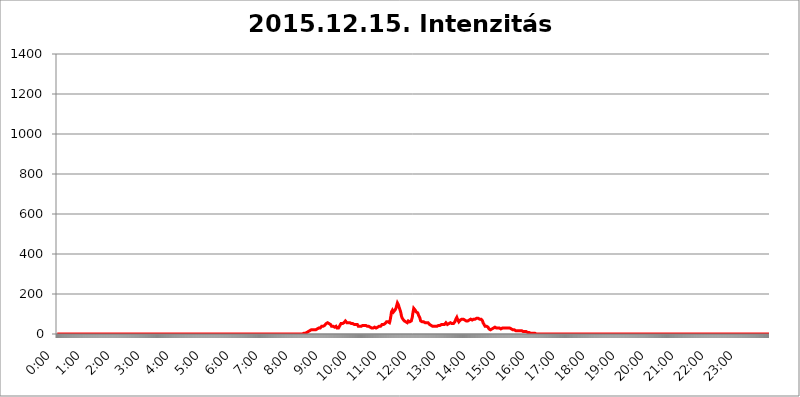
| Category | 2015.12.15. Intenzitás [W/m^2] |
|---|---|
| 0.0 | 0 |
| 0.0006944444444444445 | 0 |
| 0.001388888888888889 | 0 |
| 0.0020833333333333333 | 0 |
| 0.002777777777777778 | 0 |
| 0.003472222222222222 | 0 |
| 0.004166666666666667 | 0 |
| 0.004861111111111111 | 0 |
| 0.005555555555555556 | 0 |
| 0.0062499999999999995 | 0 |
| 0.006944444444444444 | 0 |
| 0.007638888888888889 | 0 |
| 0.008333333333333333 | 0 |
| 0.009027777777777779 | 0 |
| 0.009722222222222222 | 0 |
| 0.010416666666666666 | 0 |
| 0.011111111111111112 | 0 |
| 0.011805555555555555 | 0 |
| 0.012499999999999999 | 0 |
| 0.013194444444444444 | 0 |
| 0.013888888888888888 | 0 |
| 0.014583333333333332 | 0 |
| 0.015277777777777777 | 0 |
| 0.015972222222222224 | 0 |
| 0.016666666666666666 | 0 |
| 0.017361111111111112 | 0 |
| 0.018055555555555557 | 0 |
| 0.01875 | 0 |
| 0.019444444444444445 | 0 |
| 0.02013888888888889 | 0 |
| 0.020833333333333332 | 0 |
| 0.02152777777777778 | 0 |
| 0.022222222222222223 | 0 |
| 0.02291666666666667 | 0 |
| 0.02361111111111111 | 0 |
| 0.024305555555555556 | 0 |
| 0.024999999999999998 | 0 |
| 0.025694444444444447 | 0 |
| 0.02638888888888889 | 0 |
| 0.027083333333333334 | 0 |
| 0.027777777777777776 | 0 |
| 0.02847222222222222 | 0 |
| 0.029166666666666664 | 0 |
| 0.029861111111111113 | 0 |
| 0.030555555555555555 | 0 |
| 0.03125 | 0 |
| 0.03194444444444445 | 0 |
| 0.03263888888888889 | 0 |
| 0.03333333333333333 | 0 |
| 0.034027777777777775 | 0 |
| 0.034722222222222224 | 0 |
| 0.035416666666666666 | 0 |
| 0.036111111111111115 | 0 |
| 0.03680555555555556 | 0 |
| 0.0375 | 0 |
| 0.03819444444444444 | 0 |
| 0.03888888888888889 | 0 |
| 0.03958333333333333 | 0 |
| 0.04027777777777778 | 0 |
| 0.04097222222222222 | 0 |
| 0.041666666666666664 | 0 |
| 0.042361111111111106 | 0 |
| 0.04305555555555556 | 0 |
| 0.043750000000000004 | 0 |
| 0.044444444444444446 | 0 |
| 0.04513888888888889 | 0 |
| 0.04583333333333334 | 0 |
| 0.04652777777777778 | 0 |
| 0.04722222222222222 | 0 |
| 0.04791666666666666 | 0 |
| 0.04861111111111111 | 0 |
| 0.049305555555555554 | 0 |
| 0.049999999999999996 | 0 |
| 0.05069444444444445 | 0 |
| 0.051388888888888894 | 0 |
| 0.052083333333333336 | 0 |
| 0.05277777777777778 | 0 |
| 0.05347222222222222 | 0 |
| 0.05416666666666667 | 0 |
| 0.05486111111111111 | 0 |
| 0.05555555555555555 | 0 |
| 0.05625 | 0 |
| 0.05694444444444444 | 0 |
| 0.057638888888888885 | 0 |
| 0.05833333333333333 | 0 |
| 0.05902777777777778 | 0 |
| 0.059722222222222225 | 0 |
| 0.06041666666666667 | 0 |
| 0.061111111111111116 | 0 |
| 0.06180555555555556 | 0 |
| 0.0625 | 0 |
| 0.06319444444444444 | 0 |
| 0.06388888888888888 | 0 |
| 0.06458333333333334 | 0 |
| 0.06527777777777778 | 0 |
| 0.06597222222222222 | 0 |
| 0.06666666666666667 | 0 |
| 0.06736111111111111 | 0 |
| 0.06805555555555555 | 0 |
| 0.06874999999999999 | 0 |
| 0.06944444444444443 | 0 |
| 0.07013888888888889 | 0 |
| 0.07083333333333333 | 0 |
| 0.07152777777777779 | 0 |
| 0.07222222222222223 | 0 |
| 0.07291666666666667 | 0 |
| 0.07361111111111111 | 0 |
| 0.07430555555555556 | 0 |
| 0.075 | 0 |
| 0.07569444444444444 | 0 |
| 0.0763888888888889 | 0 |
| 0.07708333333333334 | 0 |
| 0.07777777777777778 | 0 |
| 0.07847222222222222 | 0 |
| 0.07916666666666666 | 0 |
| 0.0798611111111111 | 0 |
| 0.08055555555555556 | 0 |
| 0.08125 | 0 |
| 0.08194444444444444 | 0 |
| 0.08263888888888889 | 0 |
| 0.08333333333333333 | 0 |
| 0.08402777777777777 | 0 |
| 0.08472222222222221 | 0 |
| 0.08541666666666665 | 0 |
| 0.08611111111111112 | 0 |
| 0.08680555555555557 | 0 |
| 0.08750000000000001 | 0 |
| 0.08819444444444445 | 0 |
| 0.08888888888888889 | 0 |
| 0.08958333333333333 | 0 |
| 0.09027777777777778 | 0 |
| 0.09097222222222222 | 0 |
| 0.09166666666666667 | 0 |
| 0.09236111111111112 | 0 |
| 0.09305555555555556 | 0 |
| 0.09375 | 0 |
| 0.09444444444444444 | 0 |
| 0.09513888888888888 | 0 |
| 0.09583333333333333 | 0 |
| 0.09652777777777777 | 0 |
| 0.09722222222222222 | 0 |
| 0.09791666666666667 | 0 |
| 0.09861111111111111 | 0 |
| 0.09930555555555555 | 0 |
| 0.09999999999999999 | 0 |
| 0.10069444444444443 | 0 |
| 0.1013888888888889 | 0 |
| 0.10208333333333335 | 0 |
| 0.10277777777777779 | 0 |
| 0.10347222222222223 | 0 |
| 0.10416666666666667 | 0 |
| 0.10486111111111111 | 0 |
| 0.10555555555555556 | 0 |
| 0.10625 | 0 |
| 0.10694444444444444 | 0 |
| 0.1076388888888889 | 0 |
| 0.10833333333333334 | 0 |
| 0.10902777777777778 | 0 |
| 0.10972222222222222 | 0 |
| 0.1111111111111111 | 0 |
| 0.11180555555555556 | 0 |
| 0.11180555555555556 | 0 |
| 0.1125 | 0 |
| 0.11319444444444444 | 0 |
| 0.11388888888888889 | 0 |
| 0.11458333333333333 | 0 |
| 0.11527777777777777 | 0 |
| 0.11597222222222221 | 0 |
| 0.11666666666666665 | 0 |
| 0.1173611111111111 | 0 |
| 0.11805555555555557 | 0 |
| 0.11944444444444445 | 0 |
| 0.12013888888888889 | 0 |
| 0.12083333333333333 | 0 |
| 0.12152777777777778 | 0 |
| 0.12222222222222223 | 0 |
| 0.12291666666666667 | 0 |
| 0.12291666666666667 | 0 |
| 0.12361111111111112 | 0 |
| 0.12430555555555556 | 0 |
| 0.125 | 0 |
| 0.12569444444444444 | 0 |
| 0.12638888888888888 | 0 |
| 0.12708333333333333 | 0 |
| 0.16875 | 0 |
| 0.12847222222222224 | 0 |
| 0.12916666666666668 | 0 |
| 0.12986111111111112 | 0 |
| 0.13055555555555556 | 0 |
| 0.13125 | 0 |
| 0.13194444444444445 | 0 |
| 0.1326388888888889 | 0 |
| 0.13333333333333333 | 0 |
| 0.13402777777777777 | 0 |
| 0.13402777777777777 | 0 |
| 0.13472222222222222 | 0 |
| 0.13541666666666666 | 0 |
| 0.1361111111111111 | 0 |
| 0.13749999999999998 | 0 |
| 0.13819444444444443 | 0 |
| 0.1388888888888889 | 0 |
| 0.13958333333333334 | 0 |
| 0.14027777777777778 | 0 |
| 0.14097222222222222 | 0 |
| 0.14166666666666666 | 0 |
| 0.1423611111111111 | 0 |
| 0.14305555555555557 | 0 |
| 0.14375000000000002 | 0 |
| 0.14444444444444446 | 0 |
| 0.1451388888888889 | 0 |
| 0.1451388888888889 | 0 |
| 0.14652777777777778 | 0 |
| 0.14722222222222223 | 0 |
| 0.14791666666666667 | 0 |
| 0.1486111111111111 | 0 |
| 0.14930555555555555 | 0 |
| 0.15 | 0 |
| 0.15069444444444444 | 0 |
| 0.15138888888888888 | 0 |
| 0.15208333333333332 | 0 |
| 0.15277777777777776 | 0 |
| 0.15347222222222223 | 0 |
| 0.15416666666666667 | 0 |
| 0.15486111111111112 | 0 |
| 0.15555555555555556 | 0 |
| 0.15625 | 0 |
| 0.15694444444444444 | 0 |
| 0.15763888888888888 | 0 |
| 0.15833333333333333 | 0 |
| 0.15902777777777777 | 0 |
| 0.15972222222222224 | 0 |
| 0.16041666666666668 | 0 |
| 0.16111111111111112 | 0 |
| 0.16180555555555556 | 0 |
| 0.1625 | 0 |
| 0.16319444444444445 | 0 |
| 0.1638888888888889 | 0 |
| 0.16458333333333333 | 0 |
| 0.16527777777777777 | 0 |
| 0.16597222222222222 | 0 |
| 0.16666666666666666 | 0 |
| 0.1673611111111111 | 0 |
| 0.16805555555555554 | 0 |
| 0.16874999999999998 | 0 |
| 0.16944444444444443 | 0 |
| 0.17013888888888887 | 0 |
| 0.1708333333333333 | 0 |
| 0.17152777777777775 | 0 |
| 0.17222222222222225 | 0 |
| 0.1729166666666667 | 0 |
| 0.17361111111111113 | 0 |
| 0.17430555555555557 | 0 |
| 0.17500000000000002 | 0 |
| 0.17569444444444446 | 0 |
| 0.1763888888888889 | 0 |
| 0.17708333333333334 | 0 |
| 0.17777777777777778 | 0 |
| 0.17847222222222223 | 0 |
| 0.17916666666666667 | 0 |
| 0.1798611111111111 | 0 |
| 0.18055555555555555 | 0 |
| 0.18125 | 0 |
| 0.18194444444444444 | 0 |
| 0.1826388888888889 | 0 |
| 0.18333333333333335 | 0 |
| 0.1840277777777778 | 0 |
| 0.18472222222222223 | 0 |
| 0.18541666666666667 | 0 |
| 0.18611111111111112 | 0 |
| 0.18680555555555556 | 0 |
| 0.1875 | 0 |
| 0.18819444444444444 | 0 |
| 0.18888888888888888 | 0 |
| 0.18958333333333333 | 0 |
| 0.19027777777777777 | 0 |
| 0.1909722222222222 | 0 |
| 0.19166666666666665 | 0 |
| 0.19236111111111112 | 0 |
| 0.19305555555555554 | 0 |
| 0.19375 | 0 |
| 0.19444444444444445 | 0 |
| 0.1951388888888889 | 0 |
| 0.19583333333333333 | 0 |
| 0.19652777777777777 | 0 |
| 0.19722222222222222 | 0 |
| 0.19791666666666666 | 0 |
| 0.1986111111111111 | 0 |
| 0.19930555555555554 | 0 |
| 0.19999999999999998 | 0 |
| 0.20069444444444443 | 0 |
| 0.20138888888888887 | 0 |
| 0.2020833333333333 | 0 |
| 0.2027777777777778 | 0 |
| 0.2034722222222222 | 0 |
| 0.2041666666666667 | 0 |
| 0.20486111111111113 | 0 |
| 0.20555555555555557 | 0 |
| 0.20625000000000002 | 0 |
| 0.20694444444444446 | 0 |
| 0.2076388888888889 | 0 |
| 0.20833333333333334 | 0 |
| 0.20902777777777778 | 0 |
| 0.20972222222222223 | 0 |
| 0.21041666666666667 | 0 |
| 0.2111111111111111 | 0 |
| 0.21180555555555555 | 0 |
| 0.2125 | 0 |
| 0.21319444444444444 | 0 |
| 0.2138888888888889 | 0 |
| 0.21458333333333335 | 0 |
| 0.2152777777777778 | 0 |
| 0.21597222222222223 | 0 |
| 0.21666666666666667 | 0 |
| 0.21736111111111112 | 0 |
| 0.21805555555555556 | 0 |
| 0.21875 | 0 |
| 0.21944444444444444 | 0 |
| 0.22013888888888888 | 0 |
| 0.22083333333333333 | 0 |
| 0.22152777777777777 | 0 |
| 0.2222222222222222 | 0 |
| 0.22291666666666665 | 0 |
| 0.2236111111111111 | 0 |
| 0.22430555555555556 | 0 |
| 0.225 | 0 |
| 0.22569444444444445 | 0 |
| 0.2263888888888889 | 0 |
| 0.22708333333333333 | 0 |
| 0.22777777777777777 | 0 |
| 0.22847222222222222 | 0 |
| 0.22916666666666666 | 0 |
| 0.2298611111111111 | 0 |
| 0.23055555555555554 | 0 |
| 0.23124999999999998 | 0 |
| 0.23194444444444443 | 0 |
| 0.23263888888888887 | 0 |
| 0.2333333333333333 | 0 |
| 0.2340277777777778 | 0 |
| 0.2347222222222222 | 0 |
| 0.2354166666666667 | 0 |
| 0.23611111111111113 | 0 |
| 0.23680555555555557 | 0 |
| 0.23750000000000002 | 0 |
| 0.23819444444444446 | 0 |
| 0.2388888888888889 | 0 |
| 0.23958333333333334 | 0 |
| 0.24027777777777778 | 0 |
| 0.24097222222222223 | 0 |
| 0.24166666666666667 | 0 |
| 0.2423611111111111 | 0 |
| 0.24305555555555555 | 0 |
| 0.24375 | 0 |
| 0.24444444444444446 | 0 |
| 0.24513888888888888 | 0 |
| 0.24583333333333335 | 0 |
| 0.2465277777777778 | 0 |
| 0.24722222222222223 | 0 |
| 0.24791666666666667 | 0 |
| 0.24861111111111112 | 0 |
| 0.24930555555555556 | 0 |
| 0.25 | 0 |
| 0.25069444444444444 | 0 |
| 0.2513888888888889 | 0 |
| 0.2520833333333333 | 0 |
| 0.25277777777777777 | 0 |
| 0.2534722222222222 | 0 |
| 0.25416666666666665 | 0 |
| 0.2548611111111111 | 0 |
| 0.2555555555555556 | 0 |
| 0.25625000000000003 | 0 |
| 0.2569444444444445 | 0 |
| 0.2576388888888889 | 0 |
| 0.25833333333333336 | 0 |
| 0.2590277777777778 | 0 |
| 0.25972222222222224 | 0 |
| 0.2604166666666667 | 0 |
| 0.2611111111111111 | 0 |
| 0.26180555555555557 | 0 |
| 0.2625 | 0 |
| 0.26319444444444445 | 0 |
| 0.2638888888888889 | 0 |
| 0.26458333333333334 | 0 |
| 0.2652777777777778 | 0 |
| 0.2659722222222222 | 0 |
| 0.26666666666666666 | 0 |
| 0.2673611111111111 | 0 |
| 0.26805555555555555 | 0 |
| 0.26875 | 0 |
| 0.26944444444444443 | 0 |
| 0.2701388888888889 | 0 |
| 0.2708333333333333 | 0 |
| 0.27152777777777776 | 0 |
| 0.2722222222222222 | 0 |
| 0.27291666666666664 | 0 |
| 0.2736111111111111 | 0 |
| 0.2743055555555555 | 0 |
| 0.27499999999999997 | 0 |
| 0.27569444444444446 | 0 |
| 0.27638888888888885 | 0 |
| 0.27708333333333335 | 0 |
| 0.2777777777777778 | 0 |
| 0.27847222222222223 | 0 |
| 0.2791666666666667 | 0 |
| 0.2798611111111111 | 0 |
| 0.28055555555555556 | 0 |
| 0.28125 | 0 |
| 0.28194444444444444 | 0 |
| 0.2826388888888889 | 0 |
| 0.2833333333333333 | 0 |
| 0.28402777777777777 | 0 |
| 0.2847222222222222 | 0 |
| 0.28541666666666665 | 0 |
| 0.28611111111111115 | 0 |
| 0.28680555555555554 | 0 |
| 0.28750000000000003 | 0 |
| 0.2881944444444445 | 0 |
| 0.2888888888888889 | 0 |
| 0.28958333333333336 | 0 |
| 0.2902777777777778 | 0 |
| 0.29097222222222224 | 0 |
| 0.2916666666666667 | 0 |
| 0.2923611111111111 | 0 |
| 0.29305555555555557 | 0 |
| 0.29375 | 0 |
| 0.29444444444444445 | 0 |
| 0.2951388888888889 | 0 |
| 0.29583333333333334 | 0 |
| 0.2965277777777778 | 0 |
| 0.2972222222222222 | 0 |
| 0.29791666666666666 | 0 |
| 0.2986111111111111 | 0 |
| 0.29930555555555555 | 0 |
| 0.3 | 0 |
| 0.30069444444444443 | 0 |
| 0.3013888888888889 | 0 |
| 0.3020833333333333 | 0 |
| 0.30277777777777776 | 0 |
| 0.3034722222222222 | 0 |
| 0.30416666666666664 | 0 |
| 0.3048611111111111 | 0 |
| 0.3055555555555555 | 0 |
| 0.30624999999999997 | 0 |
| 0.3069444444444444 | 0 |
| 0.3076388888888889 | 0 |
| 0.30833333333333335 | 0 |
| 0.3090277777777778 | 0 |
| 0.30972222222222223 | 0 |
| 0.3104166666666667 | 0 |
| 0.3111111111111111 | 0 |
| 0.31180555555555556 | 0 |
| 0.3125 | 0 |
| 0.31319444444444444 | 0 |
| 0.3138888888888889 | 0 |
| 0.3145833333333333 | 0 |
| 0.31527777777777777 | 0 |
| 0.3159722222222222 | 0 |
| 0.31666666666666665 | 0 |
| 0.31736111111111115 | 0 |
| 0.31805555555555554 | 0 |
| 0.31875000000000003 | 0 |
| 0.3194444444444445 | 0 |
| 0.3201388888888889 | 0 |
| 0.32083333333333336 | 0 |
| 0.3215277777777778 | 0 |
| 0.32222222222222224 | 0 |
| 0.3229166666666667 | 0 |
| 0.3236111111111111 | 0 |
| 0.32430555555555557 | 0 |
| 0.325 | 0 |
| 0.32569444444444445 | 0 |
| 0.3263888888888889 | 0 |
| 0.32708333333333334 | 0 |
| 0.3277777777777778 | 0 |
| 0.3284722222222222 | 0 |
| 0.32916666666666666 | 0 |
| 0.3298611111111111 | 0 |
| 0.33055555555555555 | 0 |
| 0.33125 | 0 |
| 0.33194444444444443 | 0 |
| 0.3326388888888889 | 0 |
| 0.3333333333333333 | 0 |
| 0.3340277777777778 | 0 |
| 0.3347222222222222 | 0 |
| 0.3354166666666667 | 0 |
| 0.3361111111111111 | 0 |
| 0.3368055555555556 | 0 |
| 0.33749999999999997 | 0 |
| 0.33819444444444446 | 0 |
| 0.33888888888888885 | 0 |
| 0.33958333333333335 | 0 |
| 0.34027777777777773 | 0 |
| 0.34097222222222223 | 0 |
| 0.3416666666666666 | 0 |
| 0.3423611111111111 | 0 |
| 0.3430555555555555 | 0 |
| 0.34375 | 0 |
| 0.3444444444444445 | 3.525 |
| 0.3451388888888889 | 3.525 |
| 0.3458333333333334 | 3.525 |
| 0.34652777777777777 | 3.525 |
| 0.34722222222222227 | 3.525 |
| 0.34791666666666665 | 3.525 |
| 0.34861111111111115 | 3.525 |
| 0.34930555555555554 | 7.887 |
| 0.35000000000000003 | 7.887 |
| 0.3506944444444444 | 12.257 |
| 0.3513888888888889 | 12.257 |
| 0.3520833333333333 | 12.257 |
| 0.3527777777777778 | 16.636 |
| 0.3534722222222222 | 16.636 |
| 0.3541666666666667 | 16.636 |
| 0.3548611111111111 | 16.636 |
| 0.35555555555555557 | 21.024 |
| 0.35625 | 21.024 |
| 0.35694444444444445 | 21.024 |
| 0.3576388888888889 | 21.024 |
| 0.35833333333333334 | 21.024 |
| 0.3590277777777778 | 21.024 |
| 0.3597222222222222 | 21.024 |
| 0.36041666666666666 | 21.024 |
| 0.3611111111111111 | 21.024 |
| 0.36180555555555555 | 21.024 |
| 0.3625 | 21.024 |
| 0.36319444444444443 | 21.024 |
| 0.3638888888888889 | 21.024 |
| 0.3645833333333333 | 25.419 |
| 0.3652777777777778 | 25.419 |
| 0.3659722222222222 | 25.419 |
| 0.3666666666666667 | 29.823 |
| 0.3673611111111111 | 29.823 |
| 0.3680555555555556 | 29.823 |
| 0.36874999999999997 | 29.823 |
| 0.36944444444444446 | 34.234 |
| 0.37013888888888885 | 34.234 |
| 0.37083333333333335 | 38.653 |
| 0.37152777777777773 | 38.653 |
| 0.37222222222222223 | 38.653 |
| 0.3729166666666666 | 38.653 |
| 0.3736111111111111 | 38.653 |
| 0.3743055555555555 | 43.079 |
| 0.375 | 43.079 |
| 0.3756944444444445 | 43.079 |
| 0.3763888888888889 | 47.511 |
| 0.3770833333333334 | 51.951 |
| 0.37777777777777777 | 56.398 |
| 0.37847222222222227 | 56.398 |
| 0.37916666666666665 | 56.398 |
| 0.37986111111111115 | 56.398 |
| 0.38055555555555554 | 56.398 |
| 0.38125000000000003 | 51.951 |
| 0.3819444444444444 | 47.511 |
| 0.3826388888888889 | 51.951 |
| 0.3833333333333333 | 47.511 |
| 0.3840277777777778 | 43.079 |
| 0.3847222222222222 | 38.653 |
| 0.3854166666666667 | 38.653 |
| 0.3861111111111111 | 38.653 |
| 0.38680555555555557 | 38.653 |
| 0.3875 | 34.234 |
| 0.38819444444444445 | 34.234 |
| 0.3888888888888889 | 34.234 |
| 0.38958333333333334 | 38.653 |
| 0.3902777777777778 | 38.653 |
| 0.3909722222222222 | 38.653 |
| 0.39166666666666666 | 34.234 |
| 0.3923611111111111 | 29.823 |
| 0.39305555555555555 | 29.823 |
| 0.39375 | 29.823 |
| 0.39444444444444443 | 29.823 |
| 0.3951388888888889 | 29.823 |
| 0.3958333333333333 | 38.653 |
| 0.3965277777777778 | 38.653 |
| 0.3972222222222222 | 43.079 |
| 0.3979166666666667 | 51.951 |
| 0.3986111111111111 | 56.398 |
| 0.3993055555555556 | 51.951 |
| 0.39999999999999997 | 51.951 |
| 0.40069444444444446 | 51.951 |
| 0.40138888888888885 | 51.951 |
| 0.40208333333333335 | 56.398 |
| 0.40277777777777773 | 56.398 |
| 0.40347222222222223 | 60.85 |
| 0.4041666666666666 | 65.31 |
| 0.4048611111111111 | 60.85 |
| 0.4055555555555555 | 60.85 |
| 0.40625 | 56.398 |
| 0.4069444444444445 | 56.398 |
| 0.4076388888888889 | 56.398 |
| 0.4083333333333334 | 56.398 |
| 0.40902777777777777 | 56.398 |
| 0.40972222222222227 | 56.398 |
| 0.41041666666666665 | 56.398 |
| 0.41111111111111115 | 51.951 |
| 0.41180555555555554 | 51.951 |
| 0.41250000000000003 | 51.951 |
| 0.4131944444444444 | 51.951 |
| 0.4138888888888889 | 51.951 |
| 0.4145833333333333 | 51.951 |
| 0.4152777777777778 | 47.511 |
| 0.4159722222222222 | 47.511 |
| 0.4166666666666667 | 47.511 |
| 0.4173611111111111 | 47.511 |
| 0.41805555555555557 | 47.511 |
| 0.41875 | 47.511 |
| 0.41944444444444445 | 47.511 |
| 0.4201388888888889 | 47.511 |
| 0.42083333333333334 | 47.511 |
| 0.4215277777777778 | 43.079 |
| 0.4222222222222222 | 38.653 |
| 0.42291666666666666 | 38.653 |
| 0.4236111111111111 | 38.653 |
| 0.42430555555555555 | 38.653 |
| 0.425 | 38.653 |
| 0.42569444444444443 | 38.653 |
| 0.4263888888888889 | 38.653 |
| 0.4270833333333333 | 38.653 |
| 0.4277777777777778 | 43.079 |
| 0.4284722222222222 | 43.079 |
| 0.4291666666666667 | 43.079 |
| 0.4298611111111111 | 43.079 |
| 0.4305555555555556 | 43.079 |
| 0.43124999999999997 | 43.079 |
| 0.43194444444444446 | 43.079 |
| 0.43263888888888885 | 43.079 |
| 0.43333333333333335 | 43.079 |
| 0.43402777777777773 | 43.079 |
| 0.43472222222222223 | 38.653 |
| 0.4354166666666666 | 38.653 |
| 0.4361111111111111 | 38.653 |
| 0.4368055555555555 | 38.653 |
| 0.4375 | 38.653 |
| 0.4381944444444445 | 38.653 |
| 0.4388888888888889 | 34.234 |
| 0.4395833333333334 | 34.234 |
| 0.44027777777777777 | 34.234 |
| 0.44097222222222227 | 29.823 |
| 0.44166666666666665 | 29.823 |
| 0.44236111111111115 | 29.823 |
| 0.44305555555555554 | 29.823 |
| 0.44375000000000003 | 34.234 |
| 0.4444444444444444 | 34.234 |
| 0.4451388888888889 | 34.234 |
| 0.4458333333333333 | 34.234 |
| 0.4465277777777778 | 29.823 |
| 0.4472222222222222 | 29.823 |
| 0.4479166666666667 | 34.234 |
| 0.4486111111111111 | 34.234 |
| 0.44930555555555557 | 34.234 |
| 0.45 | 34.234 |
| 0.45069444444444445 | 34.234 |
| 0.4513888888888889 | 38.653 |
| 0.45208333333333334 | 38.653 |
| 0.4527777777777778 | 38.653 |
| 0.4534722222222222 | 38.653 |
| 0.45416666666666666 | 43.079 |
| 0.4548611111111111 | 43.079 |
| 0.45555555555555555 | 47.511 |
| 0.45625 | 47.511 |
| 0.45694444444444443 | 47.511 |
| 0.4576388888888889 | 47.511 |
| 0.4583333333333333 | 47.511 |
| 0.4590277777777778 | 47.511 |
| 0.4597222222222222 | 51.951 |
| 0.4604166666666667 | 56.398 |
| 0.4611111111111111 | 56.398 |
| 0.4618055555555556 | 60.85 |
| 0.46249999999999997 | 60.85 |
| 0.46319444444444446 | 60.85 |
| 0.46388888888888885 | 60.85 |
| 0.46458333333333335 | 56.398 |
| 0.46527777777777773 | 56.398 |
| 0.46597222222222223 | 56.398 |
| 0.4666666666666666 | 65.31 |
| 0.4673611111111111 | 78.722 |
| 0.4680555555555555 | 92.184 |
| 0.46875 | 110.201 |
| 0.4694444444444445 | 114.716 |
| 0.4701388888888889 | 119.235 |
| 0.4708333333333334 | 114.716 |
| 0.47152777777777777 | 110.201 |
| 0.47222222222222227 | 110.201 |
| 0.47291666666666665 | 110.201 |
| 0.47361111111111115 | 119.235 |
| 0.47430555555555554 | 119.235 |
| 0.47500000000000003 | 128.284 |
| 0.4756944444444444 | 132.814 |
| 0.4763888888888889 | 146.423 |
| 0.4770833333333333 | 155.509 |
| 0.4777777777777778 | 155.509 |
| 0.4784722222222222 | 146.423 |
| 0.4791666666666667 | 137.347 |
| 0.4798611111111111 | 137.347 |
| 0.48055555555555557 | 132.814 |
| 0.48125 | 114.716 |
| 0.48194444444444445 | 105.69 |
| 0.4826388888888889 | 92.184 |
| 0.48333333333333334 | 83.205 |
| 0.4840277777777778 | 78.722 |
| 0.4847222222222222 | 74.246 |
| 0.48541666666666666 | 74.246 |
| 0.4861111111111111 | 69.775 |
| 0.48680555555555555 | 65.31 |
| 0.4875 | 60.85 |
| 0.48819444444444443 | 60.85 |
| 0.4888888888888889 | 60.85 |
| 0.4895833333333333 | 60.85 |
| 0.4902777777777778 | 56.398 |
| 0.4909722222222222 | 56.398 |
| 0.4916666666666667 | 60.85 |
| 0.4923611111111111 | 65.31 |
| 0.4930555555555556 | 60.85 |
| 0.49374999999999997 | 60.85 |
| 0.49444444444444446 | 60.85 |
| 0.49513888888888885 | 60.85 |
| 0.49583333333333335 | 60.85 |
| 0.49652777777777773 | 65.31 |
| 0.49722222222222223 | 74.246 |
| 0.4979166666666666 | 83.205 |
| 0.4986111111111111 | 101.184 |
| 0.4993055555555555 | 114.716 |
| 0.5 | 128.284 |
| 0.5006944444444444 | 132.814 |
| 0.5013888888888889 | 128.284 |
| 0.5020833333333333 | 119.235 |
| 0.5027777777777778 | 114.716 |
| 0.5034722222222222 | 110.201 |
| 0.5041666666666667 | 110.201 |
| 0.5048611111111111 | 110.201 |
| 0.5055555555555555 | 105.69 |
| 0.50625 | 101.184 |
| 0.5069444444444444 | 92.184 |
| 0.5076388888888889 | 87.692 |
| 0.5083333333333333 | 83.205 |
| 0.5090277777777777 | 74.246 |
| 0.5097222222222222 | 65.31 |
| 0.5104166666666666 | 65.31 |
| 0.5111111111111112 | 60.85 |
| 0.5118055555555555 | 60.85 |
| 0.5125000000000001 | 60.85 |
| 0.5131944444444444 | 60.85 |
| 0.513888888888889 | 60.85 |
| 0.5145833333333333 | 60.85 |
| 0.5152777777777778 | 56.398 |
| 0.5159722222222222 | 56.398 |
| 0.5166666666666667 | 56.398 |
| 0.517361111111111 | 56.398 |
| 0.5180555555555556 | 56.398 |
| 0.5187499999999999 | 56.398 |
| 0.5194444444444445 | 56.398 |
| 0.5201388888888888 | 56.398 |
| 0.5208333333333334 | 51.951 |
| 0.5215277777777778 | 51.951 |
| 0.5222222222222223 | 47.511 |
| 0.5229166666666667 | 47.511 |
| 0.5236111111111111 | 47.511 |
| 0.5243055555555556 | 43.079 |
| 0.525 | 38.653 |
| 0.5256944444444445 | 38.653 |
| 0.5263888888888889 | 38.653 |
| 0.5270833333333333 | 38.653 |
| 0.5277777777777778 | 38.653 |
| 0.5284722222222222 | 38.653 |
| 0.5291666666666667 | 38.653 |
| 0.5298611111111111 | 38.653 |
| 0.5305555555555556 | 38.653 |
| 0.53125 | 38.653 |
| 0.5319444444444444 | 38.653 |
| 0.5326388888888889 | 38.653 |
| 0.5333333333333333 | 43.079 |
| 0.5340277777777778 | 43.079 |
| 0.5347222222222222 | 43.079 |
| 0.5354166666666667 | 38.653 |
| 0.5361111111111111 | 38.653 |
| 0.5368055555555555 | 43.079 |
| 0.5375 | 47.511 |
| 0.5381944444444444 | 47.511 |
| 0.5388888888888889 | 47.511 |
| 0.5395833333333333 | 47.511 |
| 0.5402777777777777 | 47.511 |
| 0.5409722222222222 | 47.511 |
| 0.5416666666666666 | 47.511 |
| 0.5423611111111112 | 47.511 |
| 0.5430555555555555 | 47.511 |
| 0.5437500000000001 | 51.951 |
| 0.5444444444444444 | 51.951 |
| 0.545138888888889 | 56.398 |
| 0.5458333333333333 | 56.398 |
| 0.5465277777777778 | 51.951 |
| 0.5472222222222222 | 47.511 |
| 0.5479166666666667 | 47.511 |
| 0.548611111111111 | 47.511 |
| 0.5493055555555556 | 51.951 |
| 0.5499999999999999 | 51.951 |
| 0.5506944444444445 | 51.951 |
| 0.5513888888888888 | 56.398 |
| 0.5520833333333334 | 56.398 |
| 0.5527777777777778 | 51.951 |
| 0.5534722222222223 | 51.951 |
| 0.5541666666666667 | 51.951 |
| 0.5548611111111111 | 51.951 |
| 0.5555555555555556 | 51.951 |
| 0.55625 | 51.951 |
| 0.5569444444444445 | 56.398 |
| 0.5576388888888889 | 60.85 |
| 0.5583333333333333 | 65.31 |
| 0.5590277777777778 | 74.246 |
| 0.5597222222222222 | 78.722 |
| 0.5604166666666667 | 83.205 |
| 0.5611111111111111 | 78.722 |
| 0.5618055555555556 | 69.775 |
| 0.5625 | 65.31 |
| 0.5631944444444444 | 60.85 |
| 0.5638888888888889 | 65.31 |
| 0.5645833333333333 | 65.31 |
| 0.5652777777777778 | 69.775 |
| 0.5659722222222222 | 74.246 |
| 0.5666666666666667 | 74.246 |
| 0.5673611111111111 | 74.246 |
| 0.5680555555555555 | 74.246 |
| 0.56875 | 78.722 |
| 0.5694444444444444 | 74.246 |
| 0.5701388888888889 | 74.246 |
| 0.5708333333333333 | 74.246 |
| 0.5715277777777777 | 69.775 |
| 0.5722222222222222 | 65.31 |
| 0.5729166666666666 | 65.31 |
| 0.5736111111111112 | 65.31 |
| 0.5743055555555555 | 60.85 |
| 0.5750000000000001 | 65.31 |
| 0.5756944444444444 | 65.31 |
| 0.576388888888889 | 69.775 |
| 0.5770833333333333 | 69.775 |
| 0.5777777777777778 | 69.775 |
| 0.5784722222222222 | 69.775 |
| 0.5791666666666667 | 74.246 |
| 0.579861111111111 | 74.246 |
| 0.5805555555555556 | 74.246 |
| 0.5812499999999999 | 74.246 |
| 0.5819444444444445 | 69.775 |
| 0.5826388888888888 | 65.31 |
| 0.5833333333333334 | 69.775 |
| 0.5840277777777778 | 74.246 |
| 0.5847222222222223 | 74.246 |
| 0.5854166666666667 | 74.246 |
| 0.5861111111111111 | 74.246 |
| 0.5868055555555556 | 74.246 |
| 0.5875 | 74.246 |
| 0.5881944444444445 | 78.722 |
| 0.5888888888888889 | 78.722 |
| 0.5895833333333333 | 78.722 |
| 0.5902777777777778 | 78.722 |
| 0.5909722222222222 | 78.722 |
| 0.5916666666666667 | 78.722 |
| 0.5923611111111111 | 74.246 |
| 0.5930555555555556 | 74.246 |
| 0.59375 | 74.246 |
| 0.5944444444444444 | 74.246 |
| 0.5951388888888889 | 69.775 |
| 0.5958333333333333 | 69.775 |
| 0.5965277777777778 | 65.31 |
| 0.5972222222222222 | 56.398 |
| 0.5979166666666667 | 51.951 |
| 0.5986111111111111 | 47.511 |
| 0.5993055555555555 | 43.079 |
| 0.6 | 38.653 |
| 0.6006944444444444 | 38.653 |
| 0.6013888888888889 | 38.653 |
| 0.6020833333333333 | 38.653 |
| 0.6027777777777777 | 38.653 |
| 0.6034722222222222 | 38.653 |
| 0.6041666666666666 | 34.234 |
| 0.6048611111111112 | 29.823 |
| 0.6055555555555555 | 25.419 |
| 0.6062500000000001 | 25.419 |
| 0.6069444444444444 | 21.024 |
| 0.607638888888889 | 21.024 |
| 0.6083333333333333 | 21.024 |
| 0.6090277777777778 | 25.419 |
| 0.6097222222222222 | 25.419 |
| 0.6104166666666667 | 25.419 |
| 0.611111111111111 | 25.419 |
| 0.6118055555555556 | 29.823 |
| 0.6124999999999999 | 29.823 |
| 0.6131944444444445 | 29.823 |
| 0.6138888888888888 | 34.234 |
| 0.6145833333333334 | 34.234 |
| 0.6152777777777778 | 34.234 |
| 0.6159722222222223 | 29.823 |
| 0.6166666666666667 | 29.823 |
| 0.6173611111111111 | 29.823 |
| 0.6180555555555556 | 29.823 |
| 0.61875 | 29.823 |
| 0.6194444444444445 | 29.823 |
| 0.6201388888888889 | 29.823 |
| 0.6208333333333333 | 29.823 |
| 0.6215277777777778 | 29.823 |
| 0.6222222222222222 | 25.419 |
| 0.6229166666666667 | 25.419 |
| 0.6236111111111111 | 29.823 |
| 0.6243055555555556 | 29.823 |
| 0.625 | 29.823 |
| 0.6256944444444444 | 29.823 |
| 0.6263888888888889 | 29.823 |
| 0.6270833333333333 | 29.823 |
| 0.6277777777777778 | 29.823 |
| 0.6284722222222222 | 29.823 |
| 0.6291666666666667 | 29.823 |
| 0.6298611111111111 | 29.823 |
| 0.6305555555555555 | 29.823 |
| 0.63125 | 29.823 |
| 0.6319444444444444 | 29.823 |
| 0.6326388888888889 | 29.823 |
| 0.6333333333333333 | 29.823 |
| 0.6340277777777777 | 29.823 |
| 0.6347222222222222 | 29.823 |
| 0.6354166666666666 | 29.823 |
| 0.6361111111111112 | 25.419 |
| 0.6368055555555555 | 25.419 |
| 0.6375000000000001 | 25.419 |
| 0.6381944444444444 | 21.024 |
| 0.638888888888889 | 21.024 |
| 0.6395833333333333 | 21.024 |
| 0.6402777777777778 | 21.024 |
| 0.6409722222222222 | 21.024 |
| 0.6416666666666667 | 21.024 |
| 0.642361111111111 | 16.636 |
| 0.6430555555555556 | 16.636 |
| 0.6437499999999999 | 16.636 |
| 0.6444444444444445 | 16.636 |
| 0.6451388888888888 | 16.636 |
| 0.6458333333333334 | 16.636 |
| 0.6465277777777778 | 16.636 |
| 0.6472222222222223 | 16.636 |
| 0.6479166666666667 | 16.636 |
| 0.6486111111111111 | 16.636 |
| 0.6493055555555556 | 16.636 |
| 0.65 | 16.636 |
| 0.6506944444444445 | 16.636 |
| 0.6513888888888889 | 16.636 |
| 0.6520833333333333 | 12.257 |
| 0.6527777777777778 | 12.257 |
| 0.6534722222222222 | 12.257 |
| 0.6541666666666667 | 12.257 |
| 0.6548611111111111 | 12.257 |
| 0.6555555555555556 | 12.257 |
| 0.65625 | 12.257 |
| 0.6569444444444444 | 12.257 |
| 0.6576388888888889 | 12.257 |
| 0.6583333333333333 | 7.887 |
| 0.6590277777777778 | 7.887 |
| 0.6597222222222222 | 7.887 |
| 0.6604166666666667 | 7.887 |
| 0.6611111111111111 | 7.887 |
| 0.6618055555555555 | 7.887 |
| 0.6625 | 7.887 |
| 0.6631944444444444 | 7.887 |
| 0.6638888888888889 | 3.525 |
| 0.6645833333333333 | 3.525 |
| 0.6652777777777777 | 3.525 |
| 0.6659722222222222 | 3.525 |
| 0.6666666666666666 | 3.525 |
| 0.6673611111111111 | 3.525 |
| 0.6680555555555556 | 3.525 |
| 0.6687500000000001 | 3.525 |
| 0.6694444444444444 | 3.525 |
| 0.6701388888888888 | 3.525 |
| 0.6708333333333334 | 3.525 |
| 0.6715277777777778 | 0 |
| 0.6722222222222222 | 0 |
| 0.6729166666666666 | 0 |
| 0.6736111111111112 | 0 |
| 0.6743055555555556 | 0 |
| 0.6749999999999999 | 0 |
| 0.6756944444444444 | 0 |
| 0.6763888888888889 | 0 |
| 0.6770833333333334 | 0 |
| 0.6777777777777777 | 0 |
| 0.6784722222222223 | 0 |
| 0.6791666666666667 | 0 |
| 0.6798611111111111 | 0 |
| 0.6805555555555555 | 0 |
| 0.68125 | 0 |
| 0.6819444444444445 | 0 |
| 0.6826388888888889 | 0 |
| 0.6833333333333332 | 0 |
| 0.6840277777777778 | 0 |
| 0.6847222222222222 | 0 |
| 0.6854166666666667 | 0 |
| 0.686111111111111 | 0 |
| 0.6868055555555556 | 0 |
| 0.6875 | 0 |
| 0.6881944444444444 | 0 |
| 0.688888888888889 | 0 |
| 0.6895833333333333 | 0 |
| 0.6902777777777778 | 0 |
| 0.6909722222222222 | 0 |
| 0.6916666666666668 | 0 |
| 0.6923611111111111 | 0 |
| 0.6930555555555555 | 0 |
| 0.69375 | 0 |
| 0.6944444444444445 | 0 |
| 0.6951388888888889 | 0 |
| 0.6958333333333333 | 0 |
| 0.6965277777777777 | 0 |
| 0.6972222222222223 | 0 |
| 0.6979166666666666 | 0 |
| 0.6986111111111111 | 0 |
| 0.6993055555555556 | 0 |
| 0.7000000000000001 | 0 |
| 0.7006944444444444 | 0 |
| 0.7013888888888888 | 0 |
| 0.7020833333333334 | 0 |
| 0.7027777777777778 | 0 |
| 0.7034722222222222 | 0 |
| 0.7041666666666666 | 0 |
| 0.7048611111111112 | 0 |
| 0.7055555555555556 | 0 |
| 0.7062499999999999 | 0 |
| 0.7069444444444444 | 0 |
| 0.7076388888888889 | 0 |
| 0.7083333333333334 | 0 |
| 0.7090277777777777 | 0 |
| 0.7097222222222223 | 0 |
| 0.7104166666666667 | 0 |
| 0.7111111111111111 | 0 |
| 0.7118055555555555 | 0 |
| 0.7125 | 0 |
| 0.7131944444444445 | 0 |
| 0.7138888888888889 | 0 |
| 0.7145833333333332 | 0 |
| 0.7152777777777778 | 0 |
| 0.7159722222222222 | 0 |
| 0.7166666666666667 | 0 |
| 0.717361111111111 | 0 |
| 0.7180555555555556 | 0 |
| 0.71875 | 0 |
| 0.7194444444444444 | 0 |
| 0.720138888888889 | 0 |
| 0.7208333333333333 | 0 |
| 0.7215277777777778 | 0 |
| 0.7222222222222222 | 0 |
| 0.7229166666666668 | 0 |
| 0.7236111111111111 | 0 |
| 0.7243055555555555 | 0 |
| 0.725 | 0 |
| 0.7256944444444445 | 0 |
| 0.7263888888888889 | 0 |
| 0.7270833333333333 | 0 |
| 0.7277777777777777 | 0 |
| 0.7284722222222223 | 0 |
| 0.7291666666666666 | 0 |
| 0.7298611111111111 | 0 |
| 0.7305555555555556 | 0 |
| 0.7312500000000001 | 0 |
| 0.7319444444444444 | 0 |
| 0.7326388888888888 | 0 |
| 0.7333333333333334 | 0 |
| 0.7340277777777778 | 0 |
| 0.7347222222222222 | 0 |
| 0.7354166666666666 | 0 |
| 0.7361111111111112 | 0 |
| 0.7368055555555556 | 0 |
| 0.7374999999999999 | 0 |
| 0.7381944444444444 | 0 |
| 0.7388888888888889 | 0 |
| 0.7395833333333334 | 0 |
| 0.7402777777777777 | 0 |
| 0.7409722222222223 | 0 |
| 0.7416666666666667 | 0 |
| 0.7423611111111111 | 0 |
| 0.7430555555555555 | 0 |
| 0.74375 | 0 |
| 0.7444444444444445 | 0 |
| 0.7451388888888889 | 0 |
| 0.7458333333333332 | 0 |
| 0.7465277777777778 | 0 |
| 0.7472222222222222 | 0 |
| 0.7479166666666667 | 0 |
| 0.748611111111111 | 0 |
| 0.7493055555555556 | 0 |
| 0.75 | 0 |
| 0.7506944444444444 | 0 |
| 0.751388888888889 | 0 |
| 0.7520833333333333 | 0 |
| 0.7527777777777778 | 0 |
| 0.7534722222222222 | 0 |
| 0.7541666666666668 | 0 |
| 0.7548611111111111 | 0 |
| 0.7555555555555555 | 0 |
| 0.75625 | 0 |
| 0.7569444444444445 | 0 |
| 0.7576388888888889 | 0 |
| 0.7583333333333333 | 0 |
| 0.7590277777777777 | 0 |
| 0.7597222222222223 | 0 |
| 0.7604166666666666 | 0 |
| 0.7611111111111111 | 0 |
| 0.7618055555555556 | 0 |
| 0.7625000000000001 | 0 |
| 0.7631944444444444 | 0 |
| 0.7638888888888888 | 0 |
| 0.7645833333333334 | 0 |
| 0.7652777777777778 | 0 |
| 0.7659722222222222 | 0 |
| 0.7666666666666666 | 0 |
| 0.7673611111111112 | 0 |
| 0.7680555555555556 | 0 |
| 0.7687499999999999 | 0 |
| 0.7694444444444444 | 0 |
| 0.7701388888888889 | 0 |
| 0.7708333333333334 | 0 |
| 0.7715277777777777 | 0 |
| 0.7722222222222223 | 0 |
| 0.7729166666666667 | 0 |
| 0.7736111111111111 | 0 |
| 0.7743055555555555 | 0 |
| 0.775 | 0 |
| 0.7756944444444445 | 0 |
| 0.7763888888888889 | 0 |
| 0.7770833333333332 | 0 |
| 0.7777777777777778 | 0 |
| 0.7784722222222222 | 0 |
| 0.7791666666666667 | 0 |
| 0.779861111111111 | 0 |
| 0.7805555555555556 | 0 |
| 0.78125 | 0 |
| 0.7819444444444444 | 0 |
| 0.782638888888889 | 0 |
| 0.7833333333333333 | 0 |
| 0.7840277777777778 | 0 |
| 0.7847222222222222 | 0 |
| 0.7854166666666668 | 0 |
| 0.7861111111111111 | 0 |
| 0.7868055555555555 | 0 |
| 0.7875 | 0 |
| 0.7881944444444445 | 0 |
| 0.7888888888888889 | 0 |
| 0.7895833333333333 | 0 |
| 0.7902777777777777 | 0 |
| 0.7909722222222223 | 0 |
| 0.7916666666666666 | 0 |
| 0.7923611111111111 | 0 |
| 0.7930555555555556 | 0 |
| 0.7937500000000001 | 0 |
| 0.7944444444444444 | 0 |
| 0.7951388888888888 | 0 |
| 0.7958333333333334 | 0 |
| 0.7965277777777778 | 0 |
| 0.7972222222222222 | 0 |
| 0.7979166666666666 | 0 |
| 0.7986111111111112 | 0 |
| 0.7993055555555556 | 0 |
| 0.7999999999999999 | 0 |
| 0.8006944444444444 | 0 |
| 0.8013888888888889 | 0 |
| 0.8020833333333334 | 0 |
| 0.8027777777777777 | 0 |
| 0.8034722222222223 | 0 |
| 0.8041666666666667 | 0 |
| 0.8048611111111111 | 0 |
| 0.8055555555555555 | 0 |
| 0.80625 | 0 |
| 0.8069444444444445 | 0 |
| 0.8076388888888889 | 0 |
| 0.8083333333333332 | 0 |
| 0.8090277777777778 | 0 |
| 0.8097222222222222 | 0 |
| 0.8104166666666667 | 0 |
| 0.811111111111111 | 0 |
| 0.8118055555555556 | 0 |
| 0.8125 | 0 |
| 0.8131944444444444 | 0 |
| 0.813888888888889 | 0 |
| 0.8145833333333333 | 0 |
| 0.8152777777777778 | 0 |
| 0.8159722222222222 | 0 |
| 0.8166666666666668 | 0 |
| 0.8173611111111111 | 0 |
| 0.8180555555555555 | 0 |
| 0.81875 | 0 |
| 0.8194444444444445 | 0 |
| 0.8201388888888889 | 0 |
| 0.8208333333333333 | 0 |
| 0.8215277777777777 | 0 |
| 0.8222222222222223 | 0 |
| 0.8229166666666666 | 0 |
| 0.8236111111111111 | 0 |
| 0.8243055555555556 | 0 |
| 0.8250000000000001 | 0 |
| 0.8256944444444444 | 0 |
| 0.8263888888888888 | 0 |
| 0.8270833333333334 | 0 |
| 0.8277777777777778 | 0 |
| 0.8284722222222222 | 0 |
| 0.8291666666666666 | 0 |
| 0.8298611111111112 | 0 |
| 0.8305555555555556 | 0 |
| 0.8312499999999999 | 0 |
| 0.8319444444444444 | 0 |
| 0.8326388888888889 | 0 |
| 0.8333333333333334 | 0 |
| 0.8340277777777777 | 0 |
| 0.8347222222222223 | 0 |
| 0.8354166666666667 | 0 |
| 0.8361111111111111 | 0 |
| 0.8368055555555555 | 0 |
| 0.8375 | 0 |
| 0.8381944444444445 | 0 |
| 0.8388888888888889 | 0 |
| 0.8395833333333332 | 0 |
| 0.8402777777777778 | 0 |
| 0.8409722222222222 | 0 |
| 0.8416666666666667 | 0 |
| 0.842361111111111 | 0 |
| 0.8430555555555556 | 0 |
| 0.84375 | 0 |
| 0.8444444444444444 | 0 |
| 0.845138888888889 | 0 |
| 0.8458333333333333 | 0 |
| 0.8465277777777778 | 0 |
| 0.8472222222222222 | 0 |
| 0.8479166666666668 | 0 |
| 0.8486111111111111 | 0 |
| 0.8493055555555555 | 0 |
| 0.85 | 0 |
| 0.8506944444444445 | 0 |
| 0.8513888888888889 | 0 |
| 0.8520833333333333 | 0 |
| 0.8527777777777777 | 0 |
| 0.8534722222222223 | 0 |
| 0.8541666666666666 | 0 |
| 0.8548611111111111 | 0 |
| 0.8555555555555556 | 0 |
| 0.8562500000000001 | 0 |
| 0.8569444444444444 | 0 |
| 0.8576388888888888 | 0 |
| 0.8583333333333334 | 0 |
| 0.8590277777777778 | 0 |
| 0.8597222222222222 | 0 |
| 0.8604166666666666 | 0 |
| 0.8611111111111112 | 0 |
| 0.8618055555555556 | 0 |
| 0.8624999999999999 | 0 |
| 0.8631944444444444 | 0 |
| 0.8638888888888889 | 0 |
| 0.8645833333333334 | 0 |
| 0.8652777777777777 | 0 |
| 0.8659722222222223 | 0 |
| 0.8666666666666667 | 0 |
| 0.8673611111111111 | 0 |
| 0.8680555555555555 | 0 |
| 0.86875 | 0 |
| 0.8694444444444445 | 0 |
| 0.8701388888888889 | 0 |
| 0.8708333333333332 | 0 |
| 0.8715277777777778 | 0 |
| 0.8722222222222222 | 0 |
| 0.8729166666666667 | 0 |
| 0.873611111111111 | 0 |
| 0.8743055555555556 | 0 |
| 0.875 | 0 |
| 0.8756944444444444 | 0 |
| 0.876388888888889 | 0 |
| 0.8770833333333333 | 0 |
| 0.8777777777777778 | 0 |
| 0.8784722222222222 | 0 |
| 0.8791666666666668 | 0 |
| 0.8798611111111111 | 0 |
| 0.8805555555555555 | 0 |
| 0.88125 | 0 |
| 0.8819444444444445 | 0 |
| 0.8826388888888889 | 0 |
| 0.8833333333333333 | 0 |
| 0.8840277777777777 | 0 |
| 0.8847222222222223 | 0 |
| 0.8854166666666666 | 0 |
| 0.8861111111111111 | 0 |
| 0.8868055555555556 | 0 |
| 0.8875000000000001 | 0 |
| 0.8881944444444444 | 0 |
| 0.8888888888888888 | 0 |
| 0.8895833333333334 | 0 |
| 0.8902777777777778 | 0 |
| 0.8909722222222222 | 0 |
| 0.8916666666666666 | 0 |
| 0.8923611111111112 | 0 |
| 0.8930555555555556 | 0 |
| 0.8937499999999999 | 0 |
| 0.8944444444444444 | 0 |
| 0.8951388888888889 | 0 |
| 0.8958333333333334 | 0 |
| 0.8965277777777777 | 0 |
| 0.8972222222222223 | 0 |
| 0.8979166666666667 | 0 |
| 0.8986111111111111 | 0 |
| 0.8993055555555555 | 0 |
| 0.9 | 0 |
| 0.9006944444444445 | 0 |
| 0.9013888888888889 | 0 |
| 0.9020833333333332 | 0 |
| 0.9027777777777778 | 0 |
| 0.9034722222222222 | 0 |
| 0.9041666666666667 | 0 |
| 0.904861111111111 | 0 |
| 0.9055555555555556 | 0 |
| 0.90625 | 0 |
| 0.9069444444444444 | 0 |
| 0.907638888888889 | 0 |
| 0.9083333333333333 | 0 |
| 0.9090277777777778 | 0 |
| 0.9097222222222222 | 0 |
| 0.9104166666666668 | 0 |
| 0.9111111111111111 | 0 |
| 0.9118055555555555 | 0 |
| 0.9125 | 0 |
| 0.9131944444444445 | 0 |
| 0.9138888888888889 | 0 |
| 0.9145833333333333 | 0 |
| 0.9152777777777777 | 0 |
| 0.9159722222222223 | 0 |
| 0.9166666666666666 | 0 |
| 0.9173611111111111 | 0 |
| 0.9180555555555556 | 0 |
| 0.9187500000000001 | 0 |
| 0.9194444444444444 | 0 |
| 0.9201388888888888 | 0 |
| 0.9208333333333334 | 0 |
| 0.9215277777777778 | 0 |
| 0.9222222222222222 | 0 |
| 0.9229166666666666 | 0 |
| 0.9236111111111112 | 0 |
| 0.9243055555555556 | 0 |
| 0.9249999999999999 | 0 |
| 0.9256944444444444 | 0 |
| 0.9263888888888889 | 0 |
| 0.9270833333333334 | 0 |
| 0.9277777777777777 | 0 |
| 0.9284722222222223 | 0 |
| 0.9291666666666667 | 0 |
| 0.9298611111111111 | 0 |
| 0.9305555555555555 | 0 |
| 0.93125 | 0 |
| 0.9319444444444445 | 0 |
| 0.9326388888888889 | 0 |
| 0.9333333333333332 | 0 |
| 0.9340277777777778 | 0 |
| 0.9347222222222222 | 0 |
| 0.9354166666666667 | 0 |
| 0.936111111111111 | 0 |
| 0.9368055555555556 | 0 |
| 0.9375 | 0 |
| 0.9381944444444444 | 0 |
| 0.938888888888889 | 0 |
| 0.9395833333333333 | 0 |
| 0.9402777777777778 | 0 |
| 0.9409722222222222 | 0 |
| 0.9416666666666668 | 0 |
| 0.9423611111111111 | 0 |
| 0.9430555555555555 | 0 |
| 0.94375 | 0 |
| 0.9444444444444445 | 0 |
| 0.9451388888888889 | 0 |
| 0.9458333333333333 | 0 |
| 0.9465277777777777 | 0 |
| 0.9472222222222223 | 0 |
| 0.9479166666666666 | 0 |
| 0.9486111111111111 | 0 |
| 0.9493055555555556 | 0 |
| 0.9500000000000001 | 0 |
| 0.9506944444444444 | 0 |
| 0.9513888888888888 | 0 |
| 0.9520833333333334 | 0 |
| 0.9527777777777778 | 0 |
| 0.9534722222222222 | 0 |
| 0.9541666666666666 | 0 |
| 0.9548611111111112 | 0 |
| 0.9555555555555556 | 0 |
| 0.9562499999999999 | 0 |
| 0.9569444444444444 | 0 |
| 0.9576388888888889 | 0 |
| 0.9583333333333334 | 0 |
| 0.9590277777777777 | 0 |
| 0.9597222222222223 | 0 |
| 0.9604166666666667 | 0 |
| 0.9611111111111111 | 0 |
| 0.9618055555555555 | 0 |
| 0.9625 | 0 |
| 0.9631944444444445 | 0 |
| 0.9638888888888889 | 0 |
| 0.9645833333333332 | 0 |
| 0.9652777777777778 | 0 |
| 0.9659722222222222 | 0 |
| 0.9666666666666667 | 0 |
| 0.967361111111111 | 0 |
| 0.9680555555555556 | 0 |
| 0.96875 | 0 |
| 0.9694444444444444 | 0 |
| 0.970138888888889 | 0 |
| 0.9708333333333333 | 0 |
| 0.9715277777777778 | 0 |
| 0.9722222222222222 | 0 |
| 0.9729166666666668 | 0 |
| 0.9736111111111111 | 0 |
| 0.9743055555555555 | 0 |
| 0.975 | 0 |
| 0.9756944444444445 | 0 |
| 0.9763888888888889 | 0 |
| 0.9770833333333333 | 0 |
| 0.9777777777777777 | 0 |
| 0.9784722222222223 | 0 |
| 0.9791666666666666 | 0 |
| 0.9798611111111111 | 0 |
| 0.9805555555555556 | 0 |
| 0.9812500000000001 | 0 |
| 0.9819444444444444 | 0 |
| 0.9826388888888888 | 0 |
| 0.9833333333333334 | 0 |
| 0.9840277777777778 | 0 |
| 0.9847222222222222 | 0 |
| 0.9854166666666666 | 0 |
| 0.9861111111111112 | 0 |
| 0.9868055555555556 | 0 |
| 0.9874999999999999 | 0 |
| 0.9881944444444444 | 0 |
| 0.9888888888888889 | 0 |
| 0.9895833333333334 | 0 |
| 0.9902777777777777 | 0 |
| 0.9909722222222223 | 0 |
| 0.9916666666666667 | 0 |
| 0.9923611111111111 | 0 |
| 0.9930555555555555 | 0 |
| 0.99375 | 0 |
| 0.9944444444444445 | 0 |
| 0.9951388888888889 | 0 |
| 0.9958333333333332 | 0 |
| 0.9965277777777778 | 0 |
| 0.9972222222222222 | 0 |
| 0.9979166666666667 | 0 |
| 0.998611111111111 | 0 |
| 0.9993055555555556 | 0 |